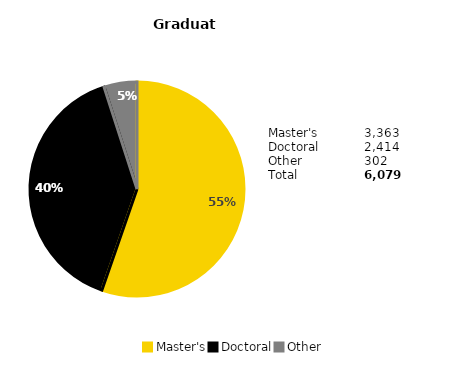
| Category | Series 0 |
|---|---|
| Master's | 0.553 |
| Doctoral | 0.397 |
| Other | 0.05 |